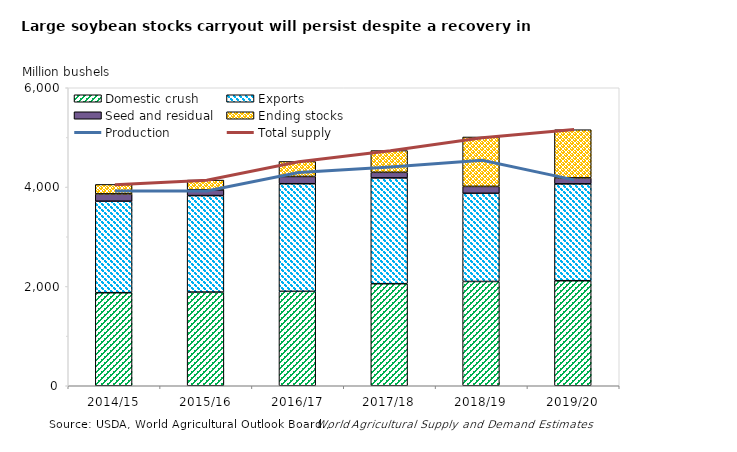
| Category | Domestic | Exports | Seed and | Ending |
|---|---|---|---|---|
| 2014/15 | 1873.494 | 1842.175 | 147.007 | 190.61 |
| 2015/16 | 1886.237 | 1942.639 | 115.325 | 196.729 |
| 2016/17 | 1901.198 | 2166.417 | 146.296 | 301.595 |
| 2017/18 | 2055 | 2130 | 112.123 | 438.105 |
| 2018/19 | 2100 | 1775 | 138.988 | 995 |
| 2019/20 | 2115 | 1950 | 120 | 970 |